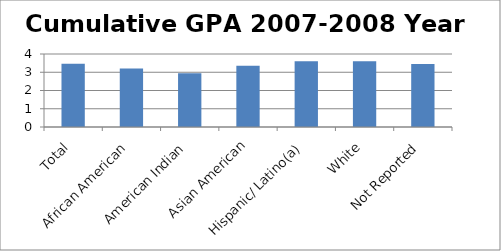
| Category | Cumulative GPA 2007-2008 Year |
|---|---|
| Total | 3.466 |
| African American | 3.2 |
| American Indian | 2.95 |
| Asian American | 3.35 |
| Hispanic/ Latino(a) | 3.6 |
| White | 3.6 |
| Not Reported | 3.45 |